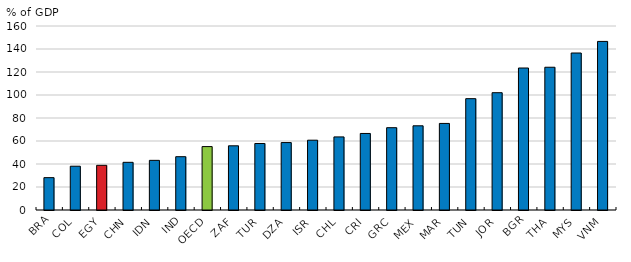
| Category | Total trade as % share of GDP, 2010-2022 |
|---|---|
|  BRA  | 28.13 |
|  COL  | 38.076 |
|  EGY  | 38.856 |
|  CHN  | 41.463 |
|  IDN  | 43.166 |
|  IND  | 46.35 |
|  OECD  | 55.138 |
|  ZAF  | 55.826 |
|  TUR  | 57.833 |
|  DZA  | 58.633 |
|  ISR  | 60.7 |
|  CHL  | 63.551 |
|  CRI  | 66.555 |
|  GRC  | 71.573 |
|  MEX  | 73.213 |
|  MAR  | 75.279 |
|  TUN  | 96.818 |
|  JOR  | 102.01 |
|  BGR  | 123.471 |
|  THA  | 124.136 |
|  MYS  | 136.52 |
|  VNM  | 146.592 |